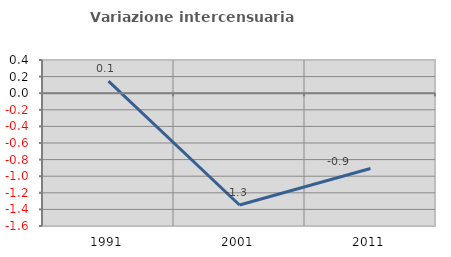
| Category | Variazione intercensuaria annua |
|---|---|
| 1991.0 | 0.146 |
| 2001.0 | -1.347 |
| 2011.0 | -0.908 |